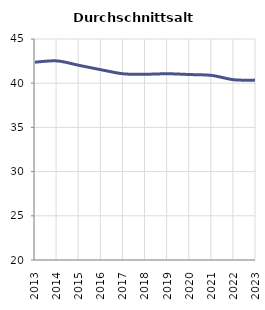
| Category | Durchschnittsalter |
|---|---|
| 2013.0 | 42.376 |
| 2014.0 | 42.521 |
| 2015.0 | 42.014 |
| 2016.0 | 41.516 |
| 2017.0 | 41.06 |
| 2018.0 | 41.014 |
| 2019.0 | 41.068 |
| 2020.0 | 40.98 |
| 2021.0 | 40.879 |
| 2022.0 | 40.39 |
| 2023.0 | 40.348 |